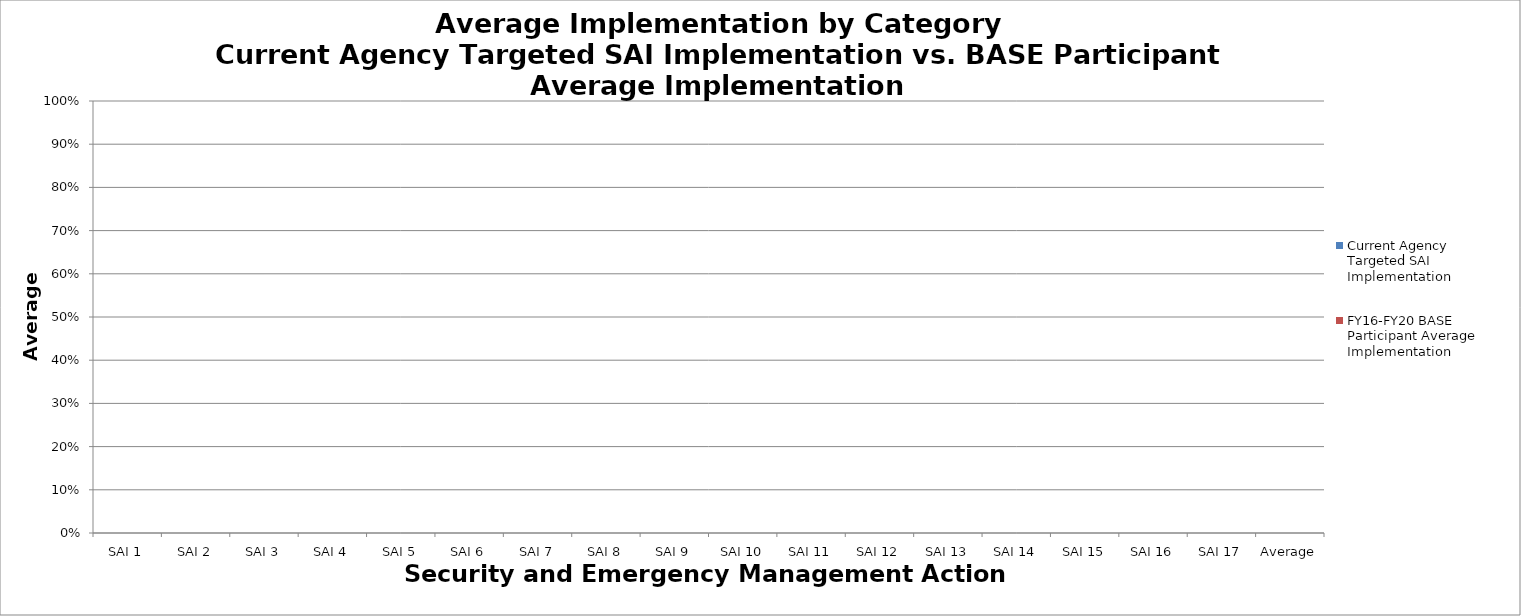
| Category | Current Agency Targeted SAI Implementation | FY16-FY20 BASE Participant Average Implementation |
|---|---|---|
| SAI 1 | 0 | 0 |
| SAI 2 | 0 | 0 |
| SAI 3 | 0 | 0 |
| SAI 4 | 0 | 0 |
| SAI 5 | 0 | 0 |
| SAI 6 | 0 | 0 |
| SAI 7 | 0 | 0 |
| SAI 8 | 0 | 0 |
| SAI 9 | 0 | 0 |
| SAI 10 | 0 | 0 |
| SAI 11 | 0 | 0 |
| SAI 12 | 0 | 0 |
| SAI 13 | 0 | 0 |
| SAI 14 | 0 | 0 |
| SAI 15 | 0 | 0 |
| SAI 16 | 0 | 0 |
| SAI 17 | 0 | 0 |
| Average | 0 | 0 |